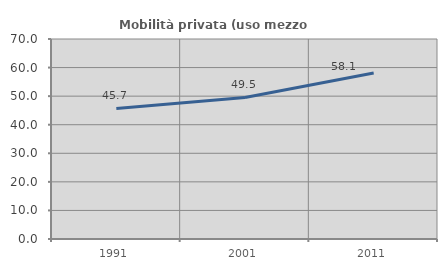
| Category | Mobilità privata (uso mezzo privato) |
|---|---|
| 1991.0 | 45.69 |
| 2001.0 | 49.531 |
| 2011.0 | 58.073 |